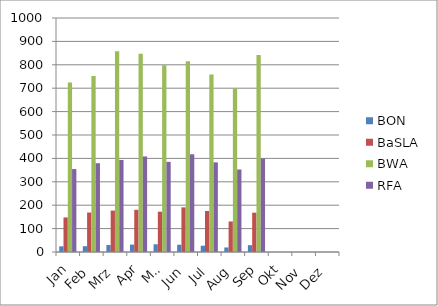
| Category | BON | BaSLA | BWA | RFA |
|---|---|---|---|---|
| Jan | 24.273 | 147.727 | 724.409 | 354.409 |
| Feb | 24.75 | 168.7 | 752.25 | 379.35 |
| Mrz | 29.8 | 177 | 858.1 | 393.35 |
| Apr | 31.714 | 180.333 | 846.81 | 408.381 |
| Mai | 33 | 172.25 | 797.85 | 385.2 |
| Jun | 31.1 | 190.8 | 814.65 | 417.65 |
| Jul | 26.957 | 175.261 | 758.174 | 383.043 |
| Aug | 19.381 | 130.476 | 699.952 | 352.667 |
| Sep | 29.143 | 168.095 | 841.381 | 399.524 |
| Okt | 0 | 0 | 0 | 0 |
| Nov | 0 | 0 | 0 | 0 |
| Dez | 0 | 0 | 0 | 0 |